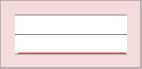
| Category | Series 1 |
|---|---|
| 0.0 | 0 |
| 0.0006 | 0 |
| 0.0012 | 0 |
| 0.0018 | 0 |
| 0.0024 | 0 |
| 0.0029999999999999996 | 0 |
| 0.0035999999999999995 | 0 |
| 0.0042 | 0 |
| 0.0048 | 0 |
| 0.005399999999999999 | 0 |
| 0.005999999999999999 | 0 |
| 0.006599999999999999 | 0 |
| 0.007199999999999999 | 0 |
| 0.007799999999999999 | 0 |
| 0.0084 | 0 |
| 0.009 | 0 |
| 0.0096 | 0 |
| 0.010199999999999999 | 0 |
| 0.010799999999999999 | 0 |
| 0.011399999999999999 | 0 |
| 0.011999999999999999 | 0 |
| 0.012599999999999998 | 0 |
| 0.013199999999999998 | 0 |
| 0.013799999999999998 | 0 |
| 0.014399999999999998 | 0 |
| 0.014999999999999998 | 0 |